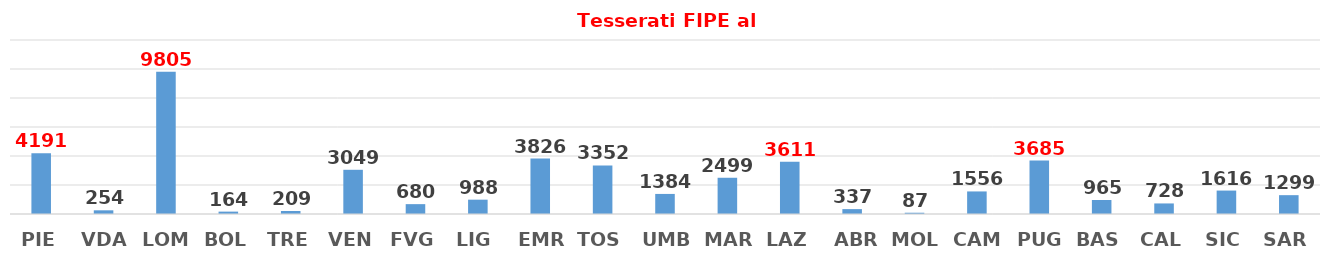
| Category | Series 0 |
|---|---|
| PIE | 4191 |
| VDA | 254 |
| LOM | 9805 |
| BOL | 164 |
| TRE | 209 |
| VEN | 3049 |
| FVG | 680 |
| LIG | 988 |
| EMR | 3826 |
| TOS | 3352 |
| UMB | 1384 |
| MAR | 2499 |
| LAZ | 3611 |
| ABR | 337 |
| MOL | 87 |
| CAM | 1556 |
| PUG | 3685 |
| BAS | 965 |
| CAL | 728 |
| SIC | 1616 |
| SAR | 1299 |